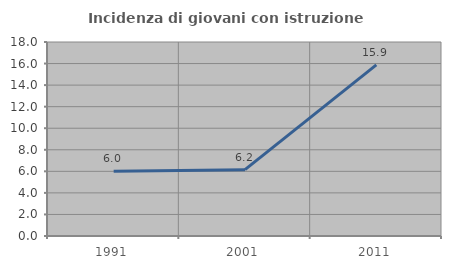
| Category | Incidenza di giovani con istruzione universitaria |
|---|---|
| 1991.0 | 6 |
| 2001.0 | 6.154 |
| 2011.0 | 15.873 |